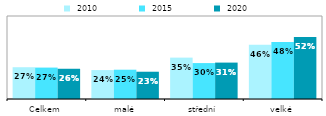
| Category |  2010 |  2015 |  2020 |
|---|---|---|---|
| Celkem | 0.268 | 0.265 | 0.255 |
| malé | 0.244 | 0.247 | 0.23 |
| střední | 0.349 | 0.303 | 0.307 |
| velké | 0.457 | 0.48 | 0.523 |